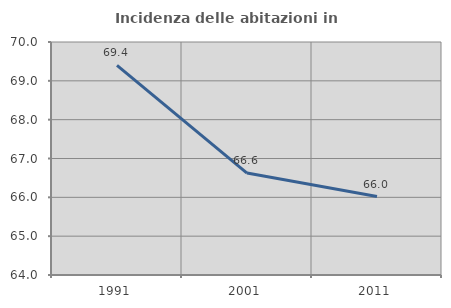
| Category | Incidenza delle abitazioni in proprietà  |
|---|---|
| 1991.0 | 69.4 |
| 2001.0 | 66.625 |
| 2011.0 | 66.019 |